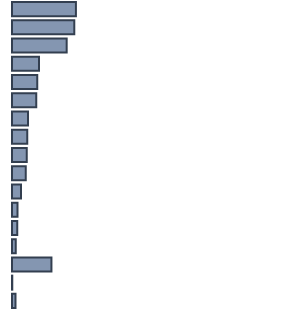
| Category | Series 0 |
|---|---|
| 0 | 23.5 |
| 1 | 22.9 |
| 2 | 20.1 |
| 3 | 9.9 |
| 4 | 9.3 |
| 5 | 8.9 |
| 6 | 5.9 |
| 7 | 5.6 |
| 8 | 5.4 |
| 9 | 5.1 |
| 10 | 3.3 |
| 11 | 2 |
| 12 | 1.9 |
| 13 | 1.4 |
| 14 | 14.5 |
| 15 | 0.1 |
| 16 | 1.3 |